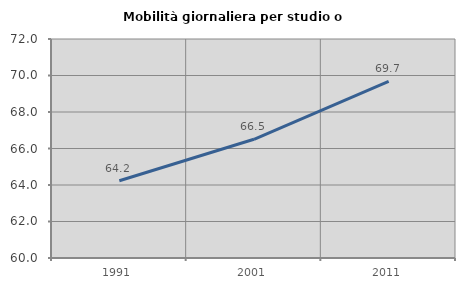
| Category | Mobilità giornaliera per studio o lavoro |
|---|---|
| 1991.0 | 64.235 |
| 2001.0 | 66.505 |
| 2011.0 | 69.685 |